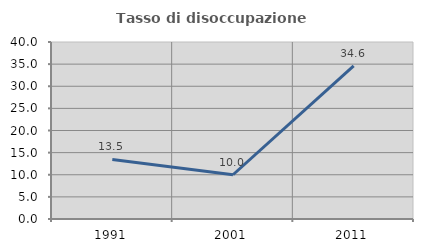
| Category | Tasso di disoccupazione giovanile  |
|---|---|
| 1991.0 | 13.462 |
| 2001.0 | 10 |
| 2011.0 | 34.615 |